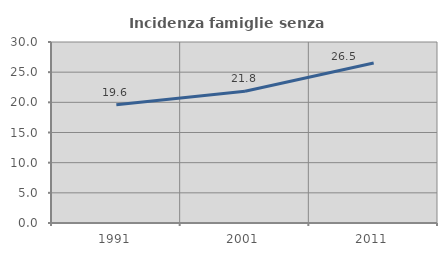
| Category | Incidenza famiglie senza nuclei |
|---|---|
| 1991.0 | 19.617 |
| 2001.0 | 21.848 |
| 2011.0 | 26.519 |